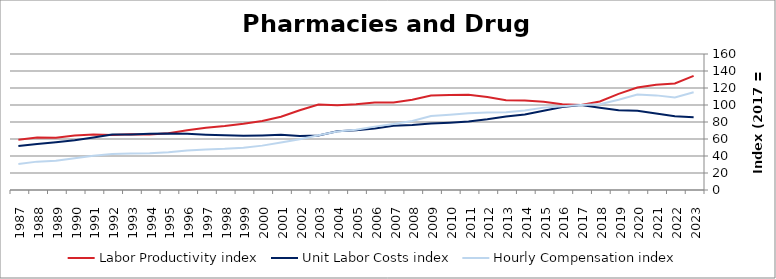
| Category | Labor Productivity index | Unit Labor Costs index | Hourly Compensation index |
|---|---|---|---|
| 2023.0 | 134.207 | 85.647 | 114.944 |
| 2022.0 | 125.237 | 86.863 | 108.785 |
| 2021.0 | 123.75 | 89.953 | 111.317 |
| 2020.0 | 120.558 | 93.129 | 112.274 |
| 2019.0 | 113.121 | 93.849 | 106.162 |
| 2018.0 | 104.16 | 96.789 | 100.815 |
| 2017.0 | 100 | 100 | 100 |
| 2016.0 | 100.986 | 97.647 | 98.609 |
| 2015.0 | 103.948 | 93.238 | 96.918 |
| 2014.0 | 105.364 | 88.866 | 93.632 |
| 2013.0 | 105.692 | 86.591 | 91.519 |
| 2012.0 | 109.379 | 83.304 | 91.117 |
| 2011.0 | 112.137 | 80.523 | 90.297 |
| 2010.0 | 111.887 | 79.185 | 88.597 |
| 2009.0 | 111.288 | 78.237 | 87.068 |
| 2008.0 | 106.208 | 76.523 | 81.273 |
| 2007.0 | 102.932 | 75.458 | 77.67 |
| 2006.0 | 103.036 | 72.371 | 74.568 |
| 2005.0 | 100.969 | 70.158 | 70.838 |
| 2004.0 | 99.78 | 68.991 | 68.839 |
| 2003.0 | 100.629 | 64.076 | 64.48 |
| 2002.0 | 93.813 | 63.585 | 59.65 |
| 2001.0 | 86.122 | 64.979 | 55.961 |
| 2000.0 | 81.261 | 64.234 | 52.197 |
| 1999.0 | 77.927 | 63.939 | 49.826 |
| 1998.0 | 75.185 | 64.48 | 48.479 |
| 1997.0 | 73.18 | 65.097 | 47.638 |
| 1996.0 | 70.299 | 66.184 | 46.526 |
| 1995.0 | 66.685 | 66.582 | 44.4 |
| 1994.0 | 65.413 | 66.087 | 43.229 |
| 1993.0 | 65.6 | 65.328 | 42.855 |
| 1992.0 | 64.631 | 65.35 | 42.236 |
| 1991.0 | 65.248 | 61.765 | 40.301 |
| 1990.0 | 64.022 | 58.474 | 37.436 |
| 1989.0 | 61.485 | 56.137 | 34.516 |
| 1988.0 | 61.658 | 54.136 | 33.379 |
| 1987.0 | 59.232 | 51.68 | 30.611 |